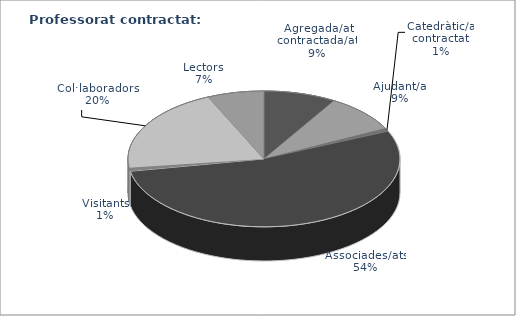
| Category | Agregada/at contractada/at Ajudant/a Catedràtic/a contractat Associades/ats Visitants Col·laboradores/ors  Lectors |
|---|---|
| Agregada/at contractada/at | 123 |
| Ajudant/a | 128 |
| Catedràtic/a contractat | 11 |
| Associades/ats | 766 |
| Visitants | 12 |
| Col·laboradores/ors  | 290 |
| Lectors | 96 |